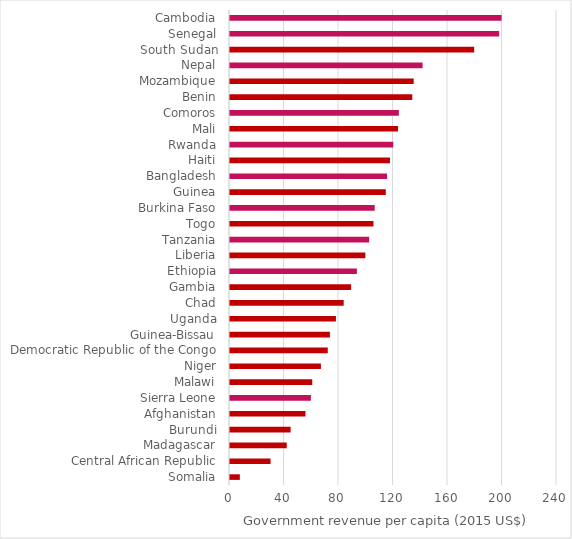
| Category | US$ per capita |
|---|---|
| Somalia | 7.219 |
| Central African Republic | 29.777 |
| Madagascar | 41.65 |
| Burundi | 44.509 |
| Afghanistan | 55.414 |
| Sierra Leone | 59.379 |
| Malawi | 60.37 |
| Niger | 66.731 |
| Democratic Republic of the Congo | 71.749 |
| Guinea-Bissau | 73.345 |
| Uganda | 77.747 |
| Chad | 83.439 |
| Gambia | 88.887 |
| Ethiopia | 93.119 |
| Liberia | 99.342 |
| Tanzania | 102.142 |
| Togo | 105.313 |
| Burkina Faso | 106.219 |
| Guinea | 114.363 |
| Bangladesh | 115.275 |
| Haiti | 117.405 |
| Rwanda | 119.834 |
| Mali | 123.319 |
| Comoros | 123.934 |
| Benin | 133.777 |
| Mozambique | 134.828 |
| Nepal | 141.357 |
| South Sudan | 179.212 |
| Senegal | 197.55 |
| Cambodia | 199.304 |